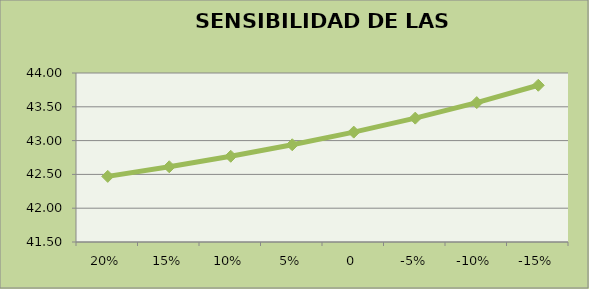
| Category | Series 0 |
|---|---|
| 0.2 | 42.471 |
| 0.15 | 42.613 |
| 0.1 | 42.768 |
| 0.05 | 42.938 |
| 0.0 | 43.125 |
| -0.05 | 43.332 |
| -0.1 | 43.562 |
| -0.15 | 43.819 |